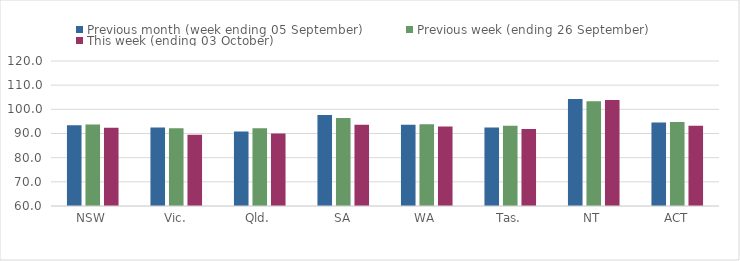
| Category | Previous month (week ending 05 September) | Previous week (ending 26 September) | This week (ending 03 October) |
|---|---|---|---|
| NSW | 93.42 | 93.7 | 92.42 |
| Vic. | 92.45 | 92.21 | 89.49 |
| Qld. | 90.84 | 92.19 | 89.96 |
| SA | 97.7 | 96.37 | 93.63 |
| WA | 93.67 | 93.84 | 92.9 |
| Tas. | 92.53 | 93.23 | 91.9 |
| NT | 104.27 | 103.35 | 103.87 |
| ACT | 94.52 | 94.71 | 93.2 |